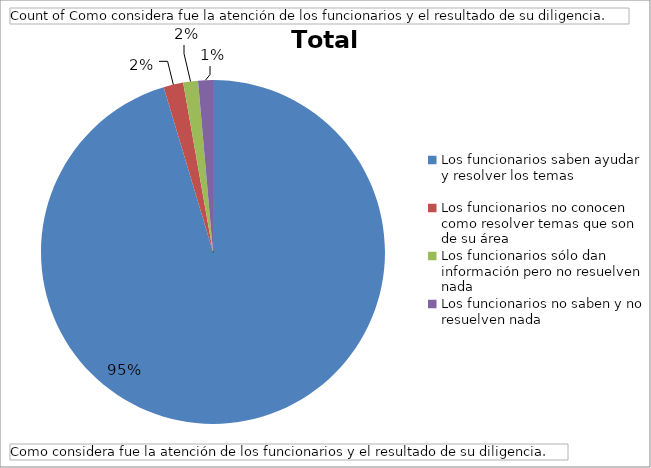
| Category | Total |
|---|---|
| Los funcionarios saben ayudar y resolver los temas | 206 |
| Los funcionarios no conocen como resolver temas que son de su área | 4 |
| Los funcionarios sólo dan información pero no resuelven nada | 3 |
| Los funcionarios no saben y no resuelven nada | 3 |